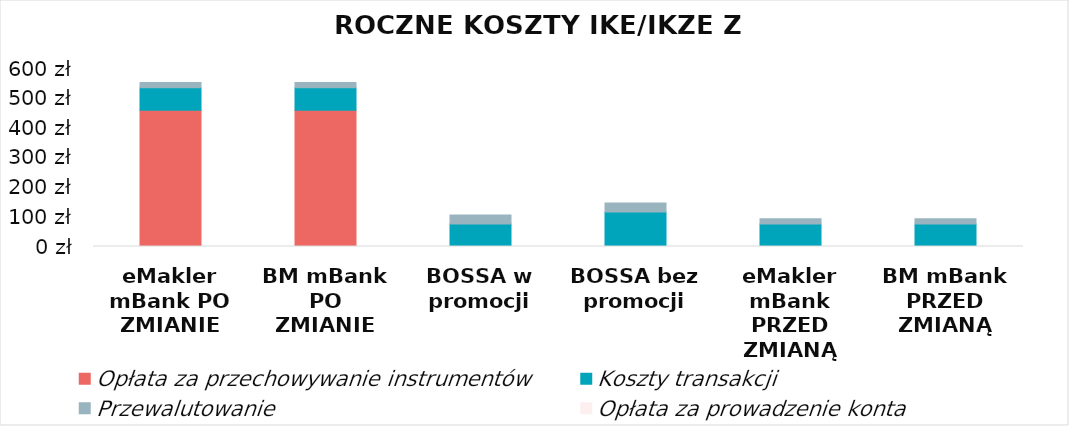
| Category | Opłata za przechowywanie instrumentów | Koszty transakcji | Przewalutowanie | Opłata za prowadzenie konta  |
|---|---|---|---|---|
| eMakler mBank PO ZMIANIE | 458.985 | 76 | 17.766 | 0 |
| BM mBank PO ZMIANIE | 458.985 | 76 | 17.766 | 0 |
| BOSSA w promocji | 0 | 76 | 30.24 | 0 |
| BOSSA bez promocji | 0 | 116 | 30.24 | 0 |
| eMakler mBank PRZED ZMIANĄ | 0 | 76 | 17.766 | 0 |
| BM mBank PRZED ZMIANĄ | 0 | 76 | 17.766 | 0 |